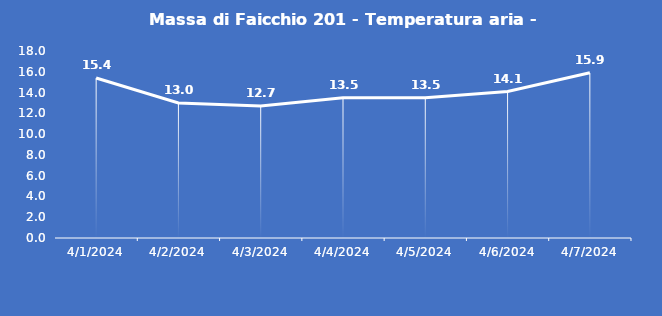
| Category | Massa di Faicchio 201 - Temperatura aria - Grezzo (°C) |
|---|---|
| 4/1/24 | 15.4 |
| 4/2/24 | 13 |
| 4/3/24 | 12.7 |
| 4/4/24 | 13.5 |
| 4/5/24 | 13.5 |
| 4/6/24 | 14.1 |
| 4/7/24 | 15.9 |